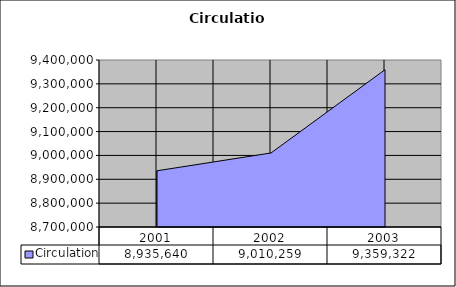
| Category | Circulation |
|---|---|
| 2001.0 | 8935640 |
| 2002.0 | 9010259 |
| 2003.0 | 9359322 |